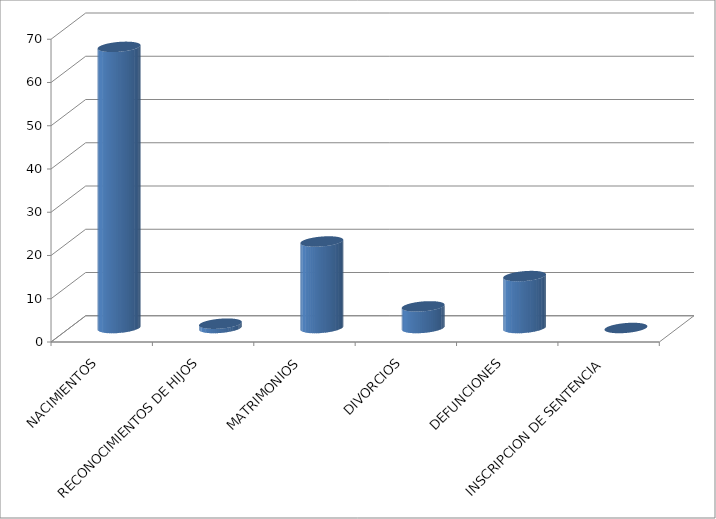
| Category | Series 0 |
|---|---|
| NACIMIENTOS | 65 |
| RECONOCIMIENTOS DE HIJOS | 1 |
| MATRIMONIOS | 20 |
| DIVORCIOS | 5 |
| DEFUNCIONES | 12 |
| INSCRIPCION DE SENTENCIA | 0 |